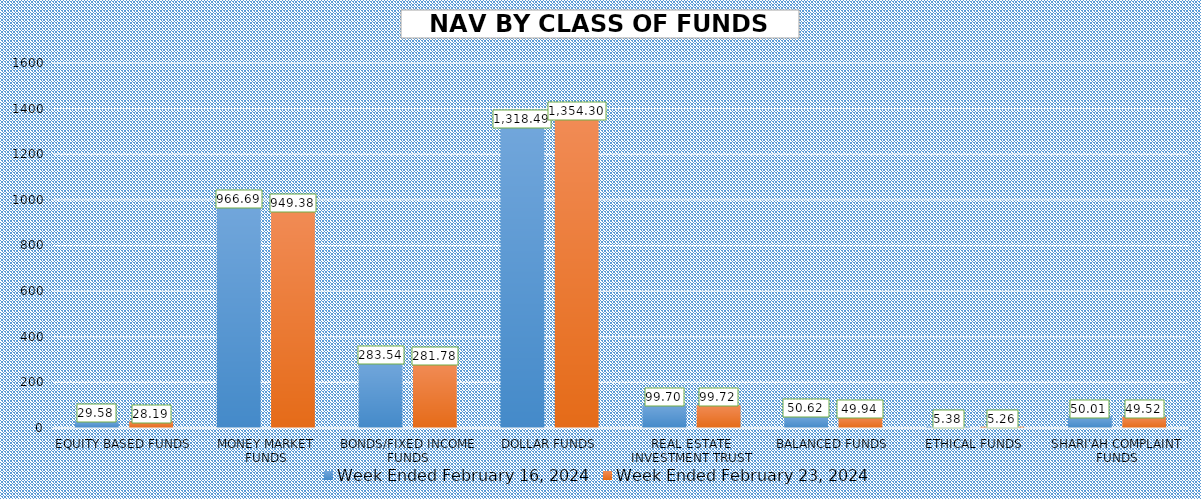
| Category | Week Ended February 16, 2024 | Week Ended February 23, 2024 |
|---|---|---|
| EQUITY BASED FUNDS | 29.579 | 28.192 |
| MONEY MARKET FUNDS | 966.685 | 949.383 |
| BONDS/FIXED INCOME FUNDS | 283.536 | 281.781 |
| DOLLAR FUNDS | 1318.495 | 1354.299 |
| REAL ESTATE INVESTMENT TRUST | 99.705 | 99.722 |
| BALANCED FUNDS | 50.623 | 49.943 |
| ETHICAL FUNDS | 5.382 | 5.257 |
| SHARI'AH COMPLAINT FUNDS | 50.009 | 49.521 |